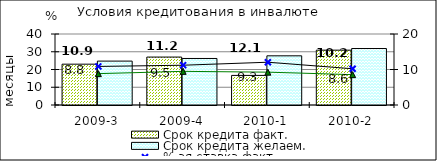
| Category | Срок кредита факт.  | Срок кредита желаем. |
|---|---|---|
| 2009-3 | 23 | 24.73 |
| 2009-4 | 27 | 26.21 |
| 2010-1 | 16.67 | 27.71 |
| 2010-2 | 30.89 | 31.82 |